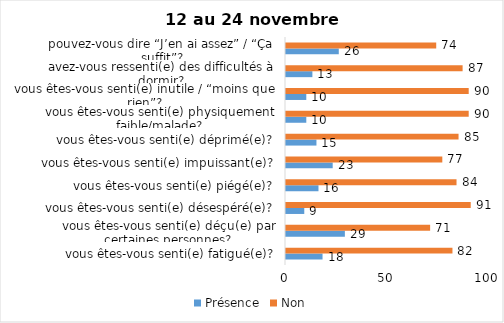
| Category | Présence | Non |
|---|---|---|
| vous êtes-vous senti(e) fatigué(e)? | 18 | 82 |
| vous êtes-vous senti(e) déçu(e) par certaines personnes? | 29 | 71 |
| vous êtes-vous senti(e) désespéré(e)? | 9 | 91 |
| vous êtes-vous senti(e) piégé(e)? | 16 | 84 |
| vous êtes-vous senti(e) impuissant(e)? | 23 | 77 |
| vous êtes-vous senti(e) déprimé(e)? | 15 | 85 |
| vous êtes-vous senti(e) physiquement faible/malade? | 10 | 90 |
| vous êtes-vous senti(e) inutile / “moins que rien”? | 10 | 90 |
| avez-vous ressenti(e) des difficultés à dormir? | 13 | 87 |
| pouvez-vous dire “J’en ai assez” / “Ça suffit”? | 26 | 74 |